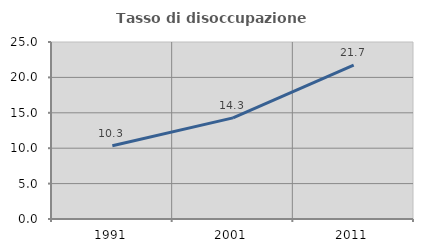
| Category | Tasso di disoccupazione giovanile  |
|---|---|
| 1991.0 | 10.345 |
| 2001.0 | 14.286 |
| 2011.0 | 21.739 |